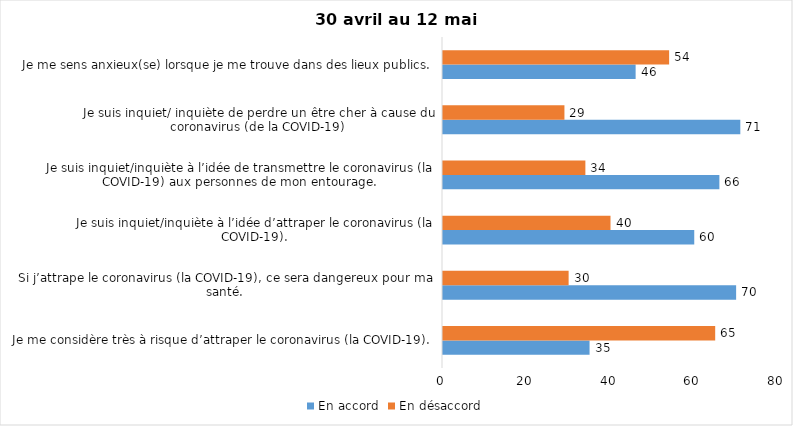
| Category | En accord | En désaccord |
|---|---|---|
| Je me considère très à risque d’attraper le coronavirus (la COVID-19). | 35 | 65 |
| Si j’attrape le coronavirus (la COVID-19), ce sera dangereux pour ma santé. | 70 | 30 |
| Je suis inquiet/inquiète à l’idée d’attraper le coronavirus (la COVID-19). | 60 | 40 |
| Je suis inquiet/inquiète à l’idée de transmettre le coronavirus (la COVID-19) aux personnes de mon entourage. | 66 | 34 |
| Je suis inquiet/ inquiète de perdre un être cher à cause du coronavirus (de la COVID-19) | 71 | 29 |
| Je me sens anxieux(se) lorsque je me trouve dans des lieux publics. | 46 | 54 |